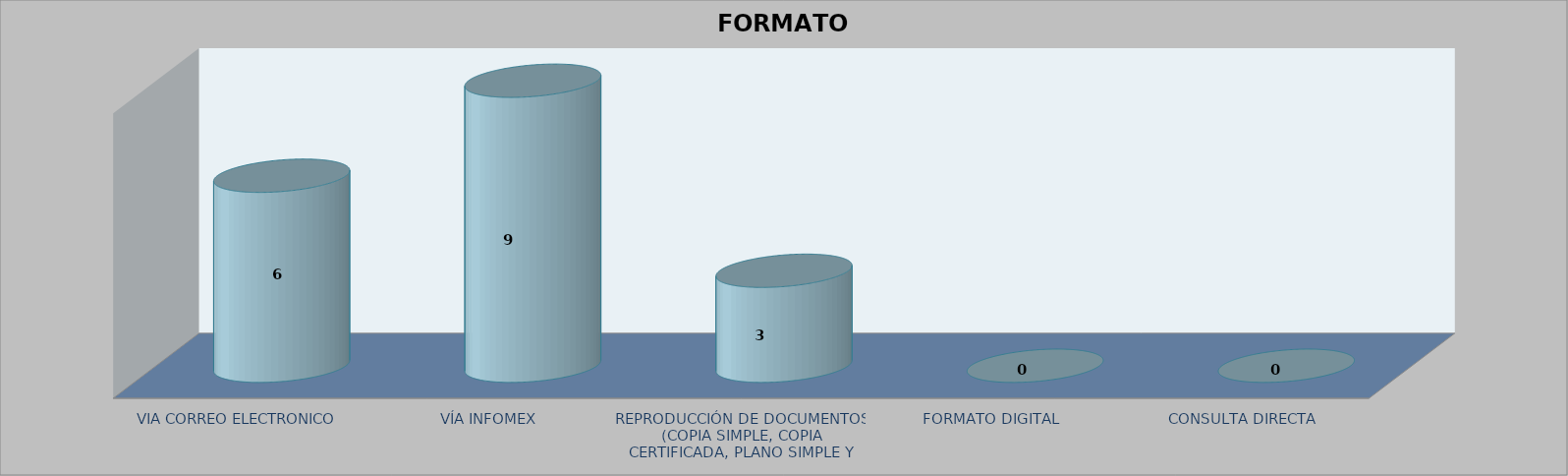
| Category |        FORMATO SOLICITADO | Series 1 | Series 2 |
|---|---|---|---|
| VIA CORREO ELECTRONICO |  |  | 6 |
| VÍA INFOMEX |  |  | 9 |
| REPRODUCCIÓN DE DOCUMENTOS (COPIA SIMPLE, COPIA CERTIFICADA, PLANO SIMPLE Y PLANO CERTIFICADO) |  |  | 3 |
| FORMATO DIGITAL |  |  | 0 |
| CONSULTA DIRECTA |  |  | 0 |